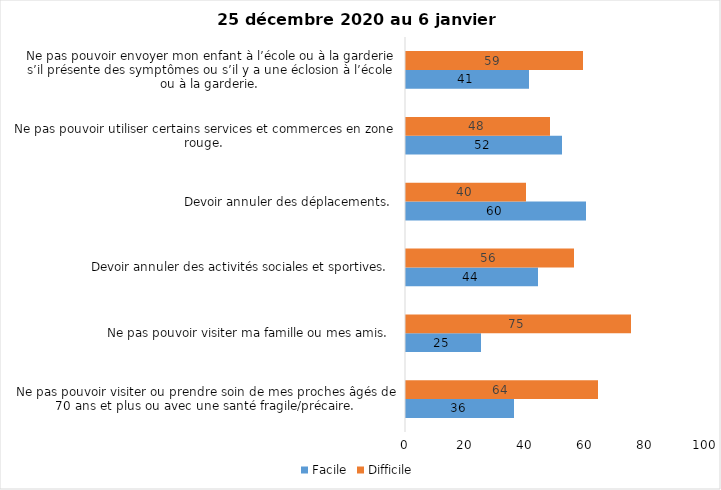
| Category | Facile | Difficile |
|---|---|---|
| Ne pas pouvoir visiter ou prendre soin de mes proches âgés de 70 ans et plus ou avec une santé fragile/précaire.  | 36 | 64 |
| Ne pas pouvoir visiter ma famille ou mes amis.  | 25 | 75 |
| Devoir annuler des activités sociales et sportives.  | 44 | 56 |
| Devoir annuler des déplacements.  | 60 | 40 |
| Ne pas pouvoir utiliser certains services et commerces en zone rouge.  | 52 | 48 |
| Ne pas pouvoir envoyer mon enfant à l’école ou à la garderie s’il présente des symptômes ou s’il y a une éclosion à l’école ou à la garderie.  | 41 | 59 |